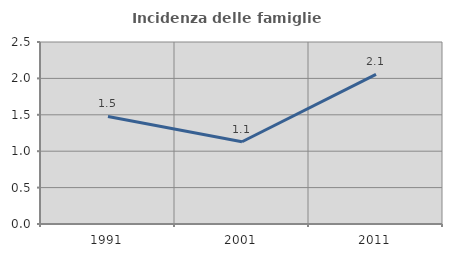
| Category | Incidenza delle famiglie numerose |
|---|---|
| 1991.0 | 1.477 |
| 2001.0 | 1.13 |
| 2011.0 | 2.055 |